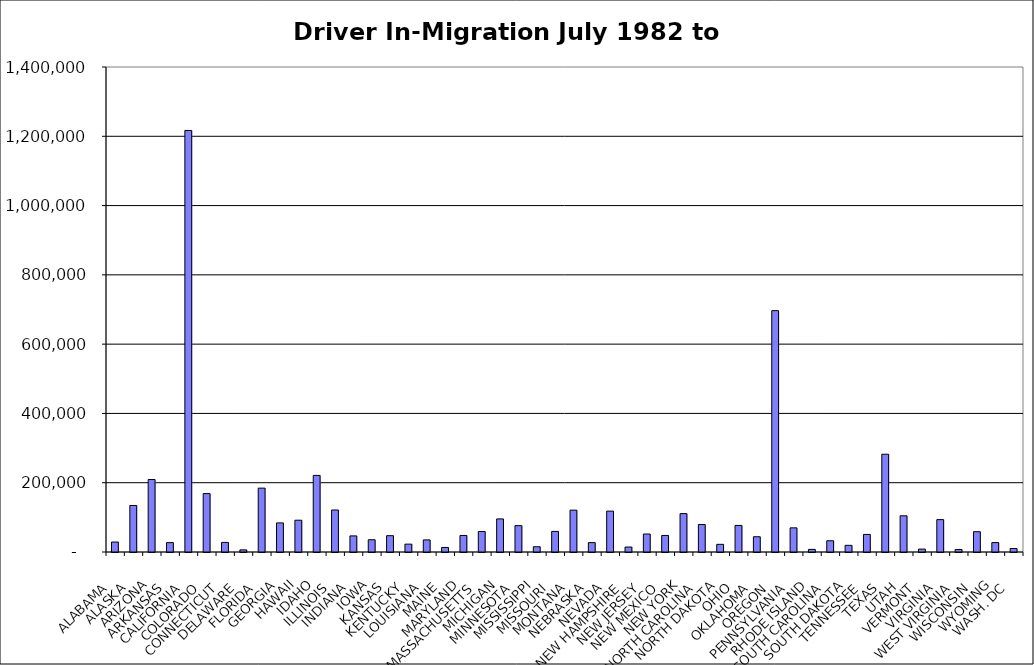
| Category | Series 0 |
|---|---|
|  ALABAMA  | 28757.5 |
|  ALASKA  | 134311.5 |
|  ARIZONA  | 209225 |
|  ARKANSAS  | 27081.5 |
|  CALIFORNIA  | 1216811.5 |
|  COLORADO  | 168641 |
|  CONNECTICUT  | 27719 |
|  DELAWARE  | 6149.5 |
|  FLORIDA  | 184377 |
|  GEORGIA  | 83969 |
|  HAWAII  | 91757.5 |
|  IDAHO  | 221091.5 |
|  ILLINOIS  | 121267.5 |
|  INDIANA  | 46488 |
|  IOWA  | 35356.5 |
|  KANSAS  | 47100.5 |
|  KENTUCKY  | 22729 |
|  LOUISIANA  | 34907.5 |
|  MAINE  | 13134.5 |
|  MARYLAND  | 47748 |
|  MASSACHUSETTS  | 59107 |
|  MICHIGAN  | 95518 |
|  MINNESOTA  | 76097.5 |
|  MISSISSIPPI  | 15161 |
|  MISSOURI  | 59425 |
|  MONTANA  | 120811 |
|  NEBRASKA  | 27069.5 |
|  NEVADA  | 118015 |
|  NEW HAMPSHIRE  | 14317.5 |
|  NEW JERSEY  | 51897 |
|  NEW MEXICO  | 47786 |
|  NEW YORK  | 110802 |
|  NORTH CAROLINA  | 79337.5 |
|  NORTH DAKOTA  | 22113.5 |
|  OHIO  | 76656.5 |
|  OKLAHOMA  | 44059 |
|  OREGON  | 696664 |
|  PENNSYLVANIA  | 69701.5 |
|  RHODE ISLAND  | 7542 |
|  SOUTH CAROLINA  | 32459.5 |
|  SOUTH DAKOTA  | 19240.5 |
|  TENNESSEE  | 50735.5 |
|  TEXAS  | 282215 |
|  UTAH  | 104476.5 |
|  VERMONT  | 8409 |
|  VIRGINIA  | 93457 |
|  WEST VIRGINIA  | 7096.5 |
|  WISCONSIN  | 58554.5 |
|  WYOMING  | 27169 |
|  WASH. DC  | 10006 |